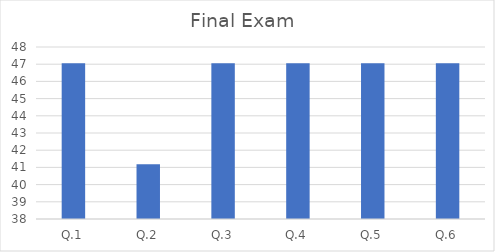
| Category | Final Exam  |
|---|---|
| Q.1 | 47.059 |
| Q.2 | 41.176 |
| Q.3 | 47.06 |
| Q.4 | 47.06 |
| Q.5 | 47.06 |
| Q.6 | 47.059 |